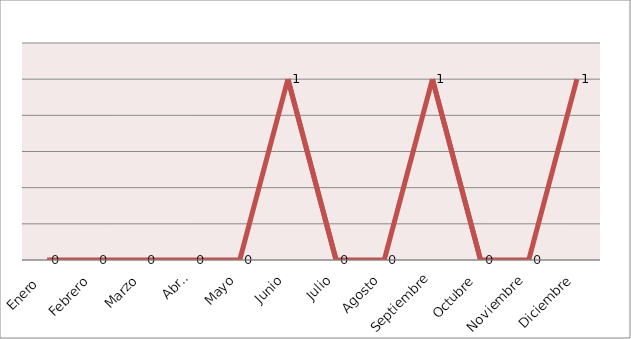
| Category | Series 0 |
|---|---|
| Enero  | 0 |
| Febrero | 0 |
| Marzo | 0 |
| Abril | 0 |
| Mayo | 0 |
| Junio | 1 |
| Julio | 0 |
| Agosto | 0 |
| Septiembre | 1 |
| Octubre | 0 |
| Noviembre | 0 |
| Diciembre | 1 |